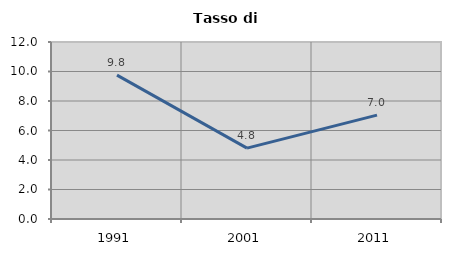
| Category | Tasso di disoccupazione   |
|---|---|
| 1991.0 | 9.752 |
| 2001.0 | 4.803 |
| 2011.0 | 7.045 |